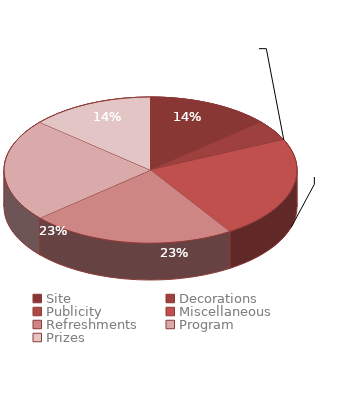
| Category | $2,200.00  |
|---|---|
| Site | 300 |
| Decorations | 100 |
| Publicity | 0 |
| Miscellaneous | 500 |
| Refreshments | 500 |
| Program | 500 |
| Prizes | 300 |